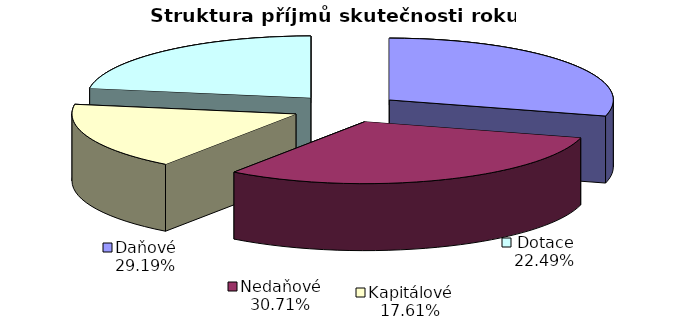
| Category | Skutečnost |
|---|---|
| Daňové | 15902 |
| Nedaňové | 16733 |
| Kapitálové | 9595 |
| Dotace | 12255 |